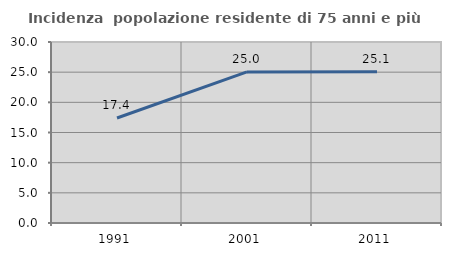
| Category | Incidenza  popolazione residente di 75 anni e più |
|---|---|
| 1991.0 | 17.397 |
| 2001.0 | 25.047 |
| 2011.0 | 25.056 |